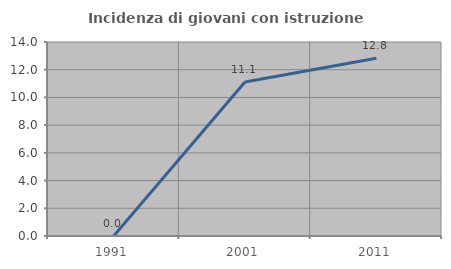
| Category | Incidenza di giovani con istruzione universitaria |
|---|---|
| 1991.0 | 0 |
| 2001.0 | 11.111 |
| 2011.0 | 12.821 |